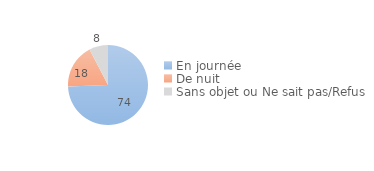
| Category | Series 0 |
|---|---|
| En journée | 74.416 |
| De nuit | 17.983 |
| Sans objet ou Ne sait pas/Refus | 7.601 |